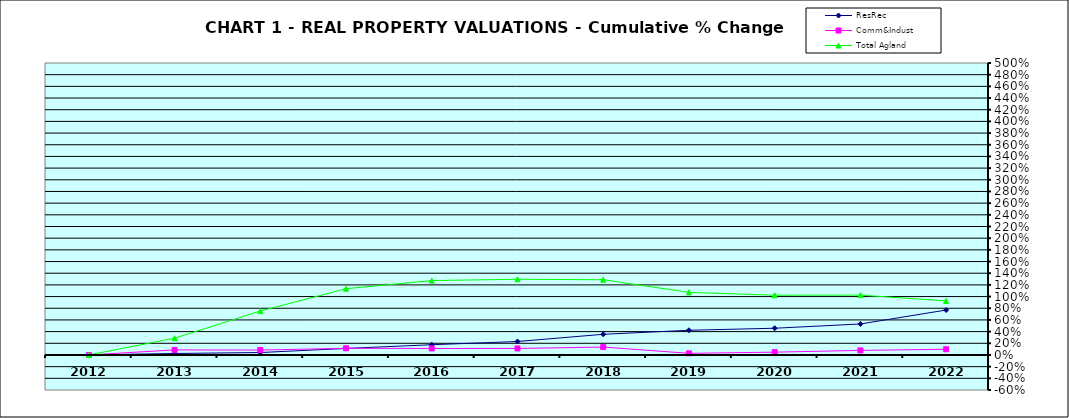
| Category | ResRec | Comm&Indust | Total Agland |
|---|---|---|---|
| 2012.0 | 0 | 0 | 0 |
| 2013.0 | 0.025 | 0.086 | 0.287 |
| 2014.0 | 0.042 | 0.084 | 0.752 |
| 2015.0 | 0.112 | 0.114 | 1.135 |
| 2016.0 | 0.175 | 0.111 | 1.274 |
| 2017.0 | 0.23 | 0.111 | 1.296 |
| 2018.0 | 0.354 | 0.135 | 1.288 |
| 2019.0 | 0.423 | 0.028 | 1.073 |
| 2020.0 | 0.458 | 0.048 | 1.023 |
| 2021.0 | 0.531 | 0.078 | 1.025 |
| 2022.0 | 0.769 | 0.098 | 0.925 |